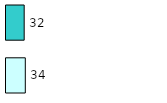
| Category | Series 0 | Series 1 |
|---|---|---|
| 0 | 34 | 32 |